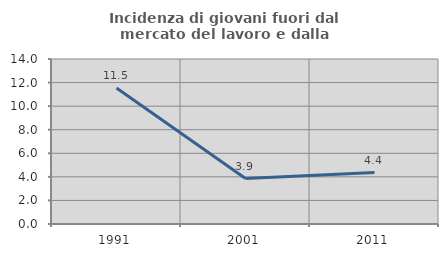
| Category | Incidenza di giovani fuori dal mercato del lavoro e dalla formazione  |
|---|---|
| 1991.0 | 11.538 |
| 2001.0 | 3.852 |
| 2011.0 | 4.364 |